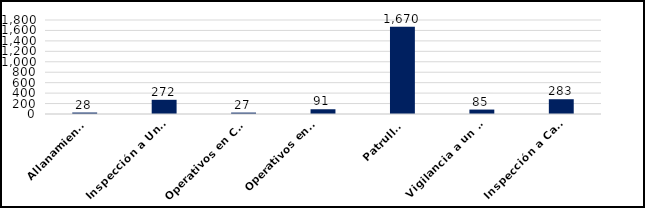
| Category | Series 0 |
|---|---|
| Allanamientos | 28 |
| Inspección a Unidades que transportan Combustibles y Mercancias  | 272 |
| Operativos en Comisión Mixta Interinstitucional | 27 |
| Operativos en Apoyo a la DSCEEC 
 | 91 |
| Patrullas | 1670 |
| Vigilancia a un Punto de Interés  | 85 |
| Inspección a Camiones de Desechos Oleosos | 283 |